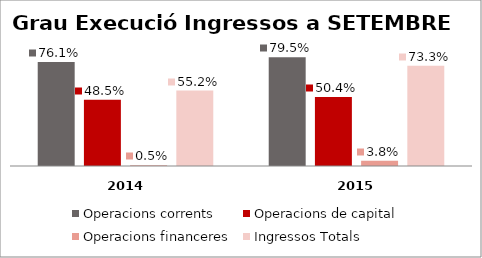
| Category | Operacions corrents | Operacions de capital | Operacions financeres | Ingressos Totals |
|---|---|---|---|---|
| 0 | 0.761 | 0.485 | 0.005 | 0.552 |
| 1 | 0.795 | 0.504 | 0.038 | 0.733 |